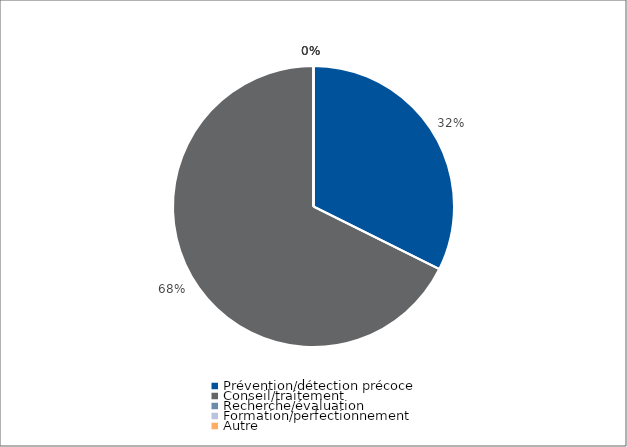
| Category | Series 0 |
|---|---|
| Prévention/détection précoce | 21354 |
| Conseil/traitement | 44667 |
| Recherche/évaluation | 0 |
| Formation/perfectionnement | 0 |
| Autre | 0 |